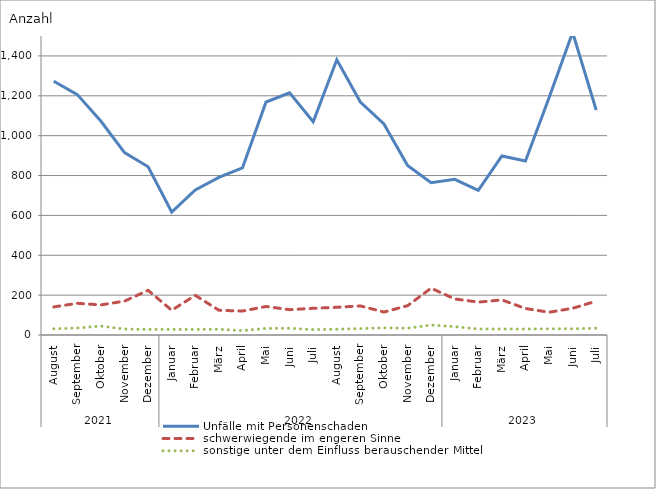
| Category | Unfälle mit Personenschaden | schwerwiegende im engeren Sinne | sonstige unter dem Einfluss berauschender Mittel |
|---|---|---|---|
| 0 | 1273 | 141 | 31 |
| 1 | 1206 | 159 | 35 |
| 2 | 1072 | 151 | 45 |
| 3 | 915 | 170 | 30 |
| 4 | 844 | 224 | 28 |
| 5 | 617 | 124 | 28 |
| 6 | 728 | 199 | 28 |
| 7 | 791 | 124 | 29 |
| 8 | 838 | 120 | 22 |
| 9 | 1169 | 143 | 33 |
| 10 | 1215 | 127 | 34 |
| 11 | 1070 | 134 | 27 |
| 12 | 1381 | 139 | 29 |
| 13 | 1169 | 146 | 32 |
| 14 | 1059 | 115 | 36 |
| 15 | 850 | 147 | 34 |
| 16 | 764 | 235 | 50 |
| 17 | 781 | 181 | 42 |
| 18 | 726 | 165 | 30 |
| 19 | 898 | 176 | 30 |
| 20 | 873 | 133 | 30 |
| 21 | 1190 | 114 | 31 |
| 22 | 1518 | 134 | 31 |
| 23 | 1129 | 170 | 34 |